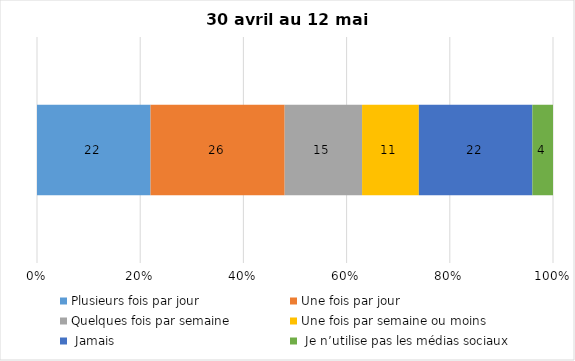
| Category | Plusieurs fois par jour | Une fois par jour | Quelques fois par semaine   | Une fois par semaine ou moins   |  Jamais   |  Je n’utilise pas les médias sociaux |
|---|---|---|---|---|---|---|
| 0 | 22 | 26 | 15 | 11 | 22 | 4 |